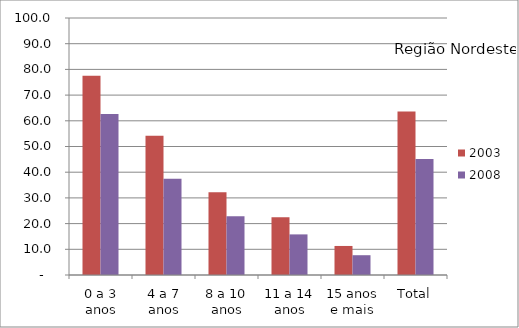
| Category | 2003 | 2008 |
|---|---|---|
| 0 a 3 anos | 77.5 | 62.6 |
| 4 a 7 anos | 54.2 | 37.5 |
| 8 a 10 anos | 32.2 | 22.9 |
| 11 a 14 anos | 22.5 | 15.8 |
| 15 anos e mais | 11.3 | 7.7 |
| Total | 63.6 | 45.1 |